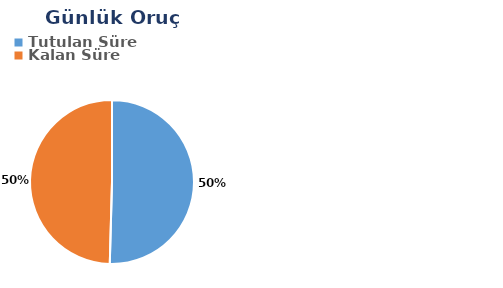
| Category | Günlük |
|---|---|
| Tutulan Süre | 0.293 |
| Kalan Süre | 0.288 |